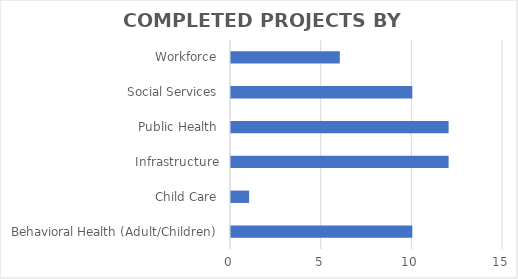
| Category | Series 0 |
|---|---|
| Behavioral Health (Adult/Children) | 10 |
| Child Care | 1 |
| Infrastructure | 12 |
| Public Health | 12 |
| Social Services | 10 |
| Workforce | 6 |